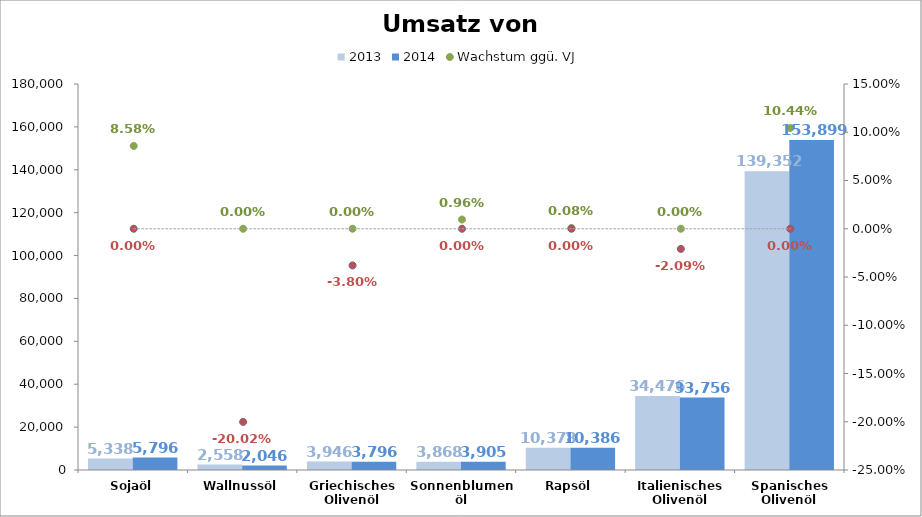
| Category | 2013 | 2014 |
|---|---|---|
| Sojaöl | 5338 | 5796 |
| Wallnussöl | 2558 | 2046 |
| Griechisches Olivenöl | 3946 | 3796 |
| Sonnenblumenöl | 3868 | 3905 |
| Rapsöl | 10378 | 10386 |
| Italienisches Olivenöl | 34476 | 33756 |
| Spanisches Olivenöl | 139352 | 153899 |